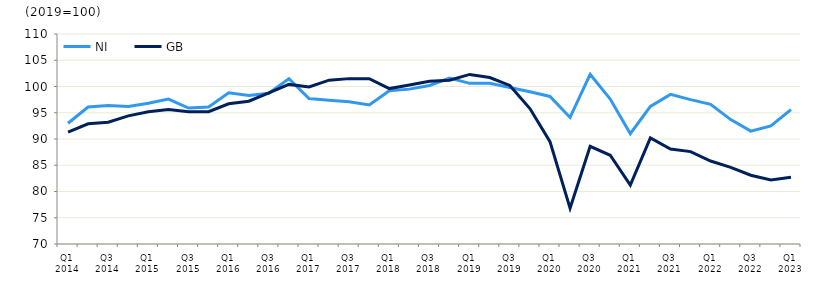
| Category | NI | GB  |
|---|---|---|
| Q1 2014 | 93 | 91.3 |
|  | 96.1 | 92.9 |
| Q3 2014 | 96.4 | 93.2 |
|  | 96.2 | 94.4 |
| Q1 2015 | 96.8 | 95.2 |
|  | 97.6 | 95.6 |
| Q3 2015 | 95.9 | 95.2 |
|  | 96.1 | 95.2 |
| Q1 2016 | 98.8 | 96.7 |
|  | 98.3 | 97.2 |
| Q3 2016 | 98.7 | 98.8 |
|  | 101.5 | 100.4 |
| Q1 2017 | 97.7 | 99.9 |
|  | 97.4 | 101.2 |
| Q3 2017 | 97.1 | 101.5 |
|  | 96.5 | 101.5 |
| Q1 2018 | 99.2 | 99.6 |
|  | 99.5 | 100.3 |
| Q3 2018 | 100.2 | 101 |
|  | 101.6 | 101.2 |
| Q1 2019 | 100.6 | 102.3 |
|  | 100.6 | 101.7 |
| Q3 2019 | 99.8 | 100.2 |
|  | 99 | 95.8 |
| Q1 2020 | 98.1 | 89.5 |
|  | 94.1 | 76.8 |
| Q3 2020 | 102.3 | 88.6 |
|  | 97.6 | 86.9 |
| Q1 2021 | 91 | 81.2 |
|  | 96.2 | 90.2 |
| Q3 2021 | 98.5 | 88.1 |
|  | 97.5 | 87.6 |
| Q1 2022 | 96.6 | 85.8 |
|  | 93.7 | 84.6 |
| Q3 2022 | 91.5 | 83.1 |
|  | 92.5 | 82.2 |
| Q1 2023 | 95.6 | 82.7 |